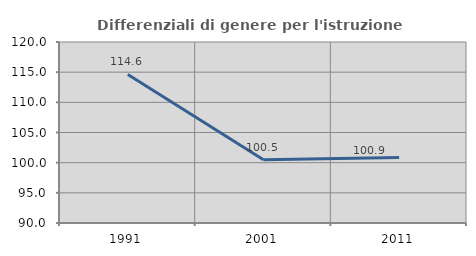
| Category | Differenziali di genere per l'istruzione superiore |
|---|---|
| 1991.0 | 114.628 |
| 2001.0 | 100.496 |
| 2011.0 | 100.854 |